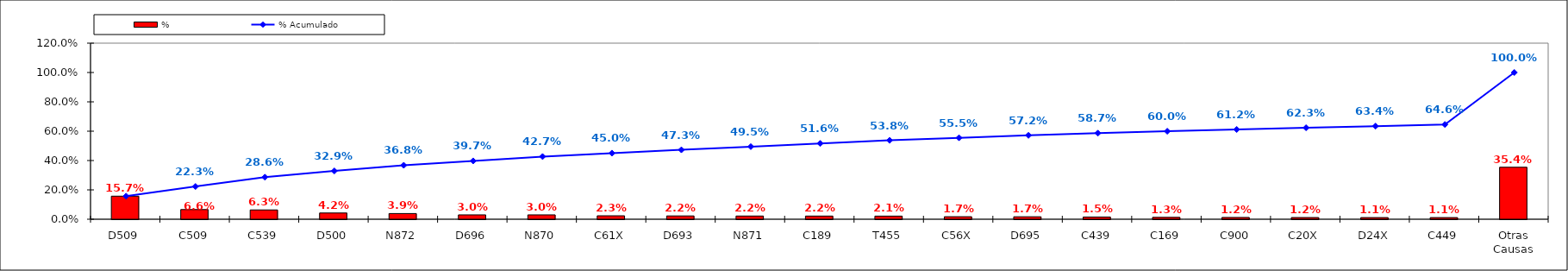
| Category | % |
|---|---|
| D509 | 0.157 |
| C509 | 0.066 |
| C539 | 0.063 |
| D500 | 0.042 |
| N872 | 0.039 |
| D696 | 0.03 |
| N870 | 0.03 |
| C61X | 0.023 |
| D693 | 0.022 |
| N871 | 0.022 |
| C189 | 0.022 |
| T455 | 0.021 |
| C56X | 0.017 |
| D695 | 0.017 |
| C439 | 0.015 |
| C169 | 0.013 |
| C900 | 0.012 |
| C20X | 0.012 |
| D24X | 0.011 |
| C449 | 0.011 |
| Otras Causas | 0.354 |